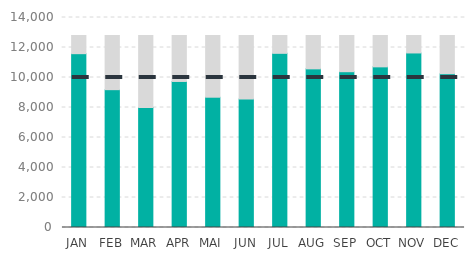
| Category | Actual | Max |
|---|---|---|
| JAN | 11588 | 1211.6 |
| FEB | 9189 | 3610.6 |
| MAR | 8001 | 4798.6 |
| APR | 9736 | 3063.6 |
| MAI | 8686 | 4113.6 |
| JUN | 8560 | 4239.6 |
| JUL | 11611 | 1188.6 |
| AUG | 10576 | 2223.6 |
| SEP | 10386 | 2413.6 |
| OCT | 10710 | 2089.6 |
| NOV | 11636 | 1163.6 |
| DEC | 10253 | 2546.6 |